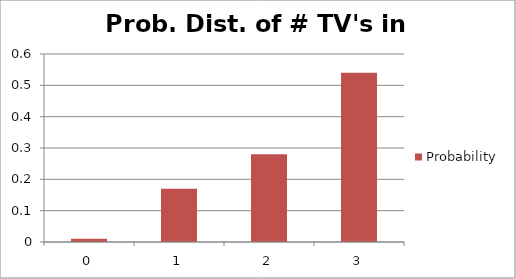
| Category | Probability |
|---|---|
| 0.0 | 0.01 |
| 1.0 | 0.17 |
| 2.0 | 0.28 |
| 3.0 | 0.54 |